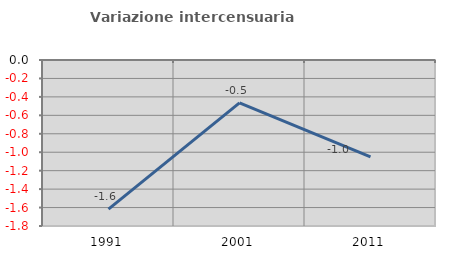
| Category | Variazione intercensuaria annua |
|---|---|
| 1991.0 | -1.617 |
| 2001.0 | -0.464 |
| 2011.0 | -1.05 |